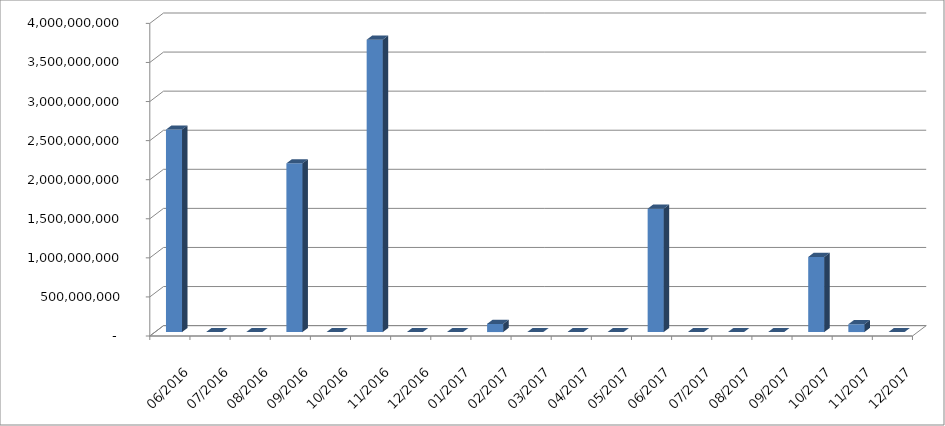
| Category | Series 0 |
|---|---|
| 2016-06-01 | 2590572647.059 |
| 2016-07-01 | 0 |
| 2016-08-01 | 0 |
| 2016-09-01 | 2158823529.412 |
| 2016-10-01 | 0 |
| 2016-11-01 | 3741129705.882 |
| 2016-12-01 | 0 |
| 2017-01-01 | 0 |
| 2017-02-01 | 104705882.353 |
| 2017-03-01 | 0 |
| 2017-04-01 | 0 |
| 2017-05-01 | 0 |
| 2017-06-01 | 1578823529.412 |
| 2017-07-01 | 0 |
| 2017-08-01 | 0 |
| 2017-09-01 | 0 |
| 2017-10-01 | 961176470.588 |
| 2017-11-01 | 100000000 |
| 2017-12-01 | 0 |